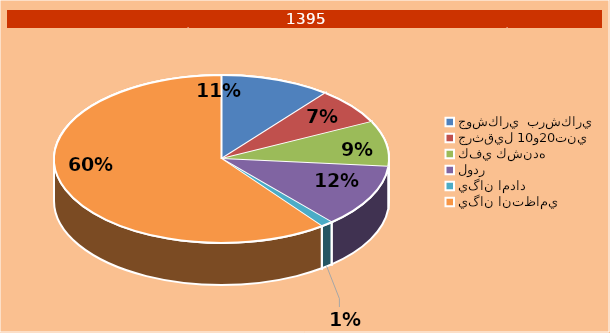
| Category | Series 0 |
|---|---|
| جوشكاري  برشكاري  | 142 |
| جرثقيل 10و20تني  | 94 |
| كفي كشنده  | 117 |
| لودر | 161 |
| يگان امداد | 16 |
| يگان انتظامي  | 802 |